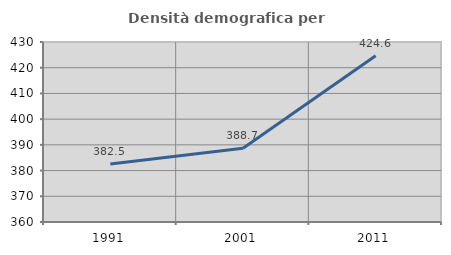
| Category | Densità demografica |
|---|---|
| 1991.0 | 382.545 |
| 2001.0 | 388.65 |
| 2011.0 | 424.649 |